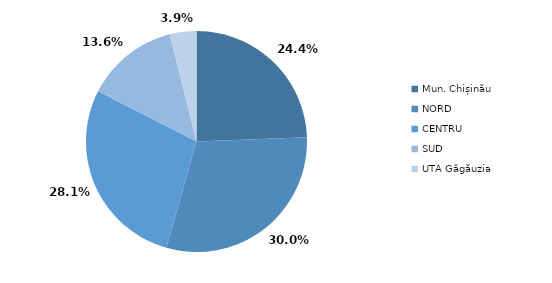
| Category | Series 0 |
|---|---|
| Mun. Chișinău | 0.244 |
| NORD | 0.3 |
| CENTRU | 0.281 |
| SUD | 0.136 |
| UTA Găgăuzia | 0.039 |